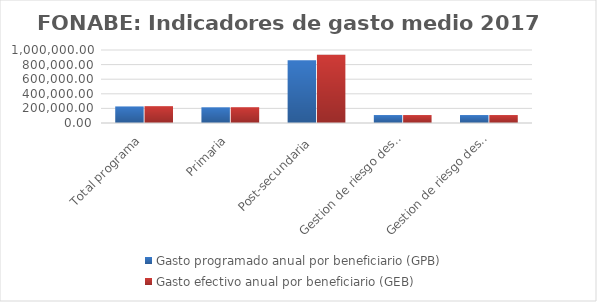
| Category | Gasto programado anual por beneficiario (GPB)  | Gasto efectivo anual por beneficiario (GEB)  |
|---|---|---|
| Total programa | 226950.594 | 230646.517 |
| Primaria | 215202.491 | 216330.237 |
| Post-secundaria  | 859807.511 | 935065.914 |
| Gestion de riesgo desastre emergencia primaria | 108900 | 108900 |
| Gestion de riesgo desastre emergencia secundaria | 108900 | 108900 |